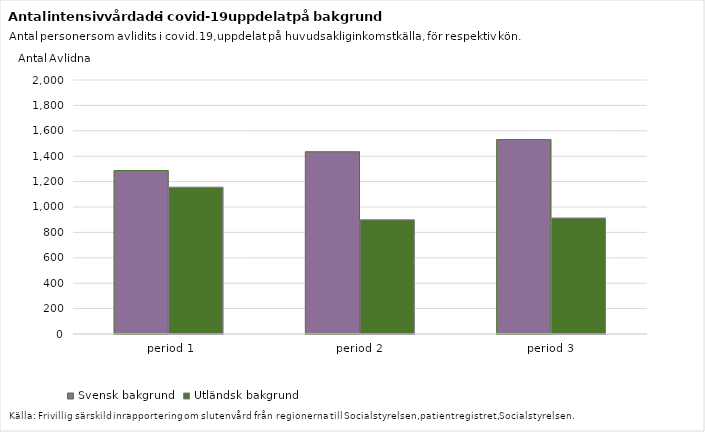
| Category | Svensk bakgrund | Utländsk bakgrund |
|---|---|---|
|  period 1 | 1287 | 1156 |
| period 2 | 1435 | 899 |
| period 3 | 1531 | 913 |